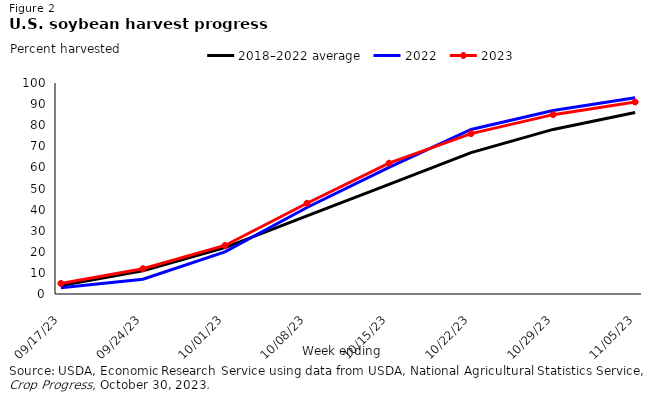
| Category | 2018–2022 average | 2022 | 2023 |
|---|---|---|---|
| 2023-09-17 | 4 | 3 | 5 |
| 2023-09-24 | 11 | 7 | 12 |
| 2023-10-01 | 22 | 20 | 23 |
| 2023-10-08 | 37 | 41 | 43 |
| 2023-10-15 | 52 | 60 | 62 |
| 2023-10-22 | 67 | 78 | 76 |
| 2023-10-29 | 78 | 87 | 85 |
| 2023-11-05 | 86 | 93 | 91 |